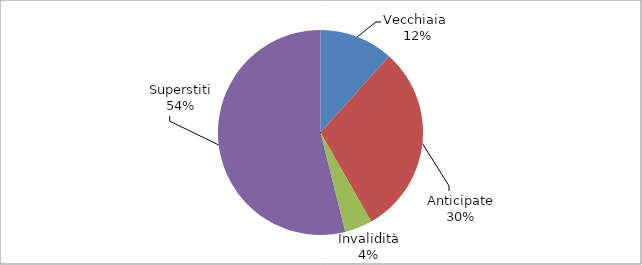
| Category | Series 0 |
|---|---|
| Vecchiaia  | 3017 |
| Anticipate | 7787 |
| Invalidità | 1126 |
| Superstiti | 13940 |